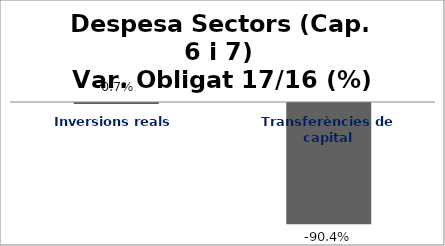
| Category | Series 0 |
|---|---|
| Inversions reals | -0.007 |
| Transferències de capital | -0.904 |